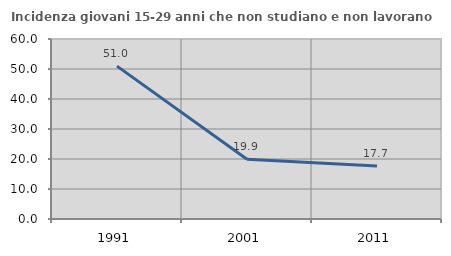
| Category | Incidenza giovani 15-29 anni che non studiano e non lavorano  |
|---|---|
| 1991.0 | 50.959 |
| 2001.0 | 19.908 |
| 2011.0 | 17.674 |